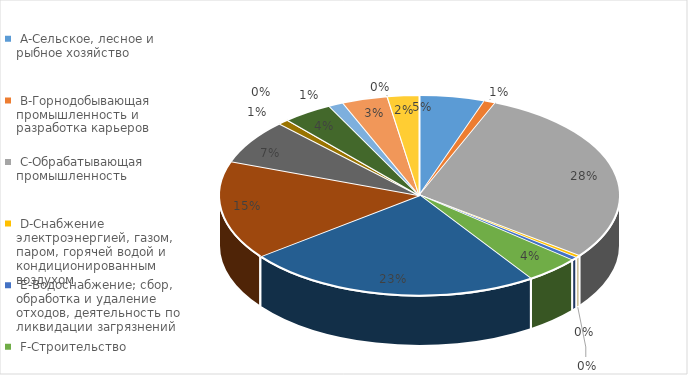
| Category |  Доля, %  |
|---|---|
|  A-Сельское, лесное и рыбное хозяйство  | 0.05 |
|  B-Горнодобывающая промышленность и разработка карьеров  | 0.009 |
|  C-Обрабатывающая промышленность  | 0.277 |
|  D-Снабжение электроэнергией, газом, паром, горячей водой и  кондиционированным воздухом  | 0.004 |
|  E-Водоснабжение; сбор, обработка и удаление отходов, деятельность по ликвидации загрязнений  | 0.005 |
|  F-Строительство  | 0.042 |
|  G-Оптовая и розничная торговля; ремонт автомобилей и мотоциклов  | 0.228 |
|  H-Транспорт и складирование  | 0.151 |
|  I-Услуги по проживанию и питанию  | 0.068 |
|  J-Информация и связь  | 0.008 |
| K-Финансовая и страховая деятельность | 0 |
| L-Операции с недвижимым имуществом | 0.038 |
| M-Профессиональная, научная и техническая деятельность | 0.011 |
| N-Деятельность в области административного и вспомогательного обслуживания | 0.035 |
| O-Государственное управление и оборона; обязательное социальное обеспечение | 0 |
| R-Искусство, развлечения и отдых | 0.024 |